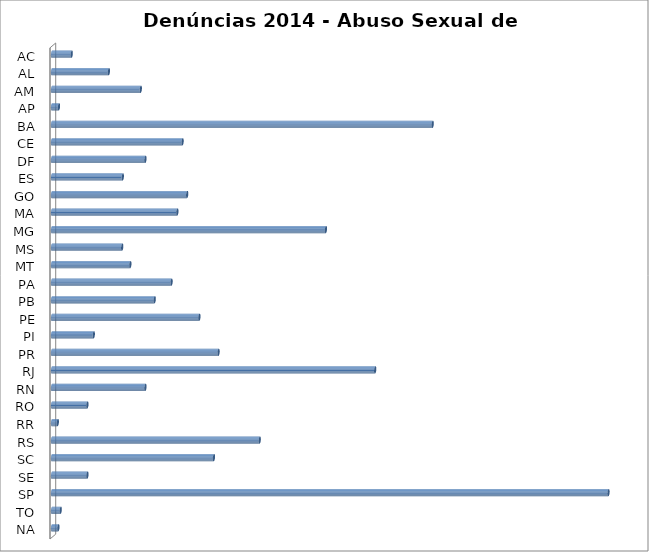
| Category | Series 0 |
|---|---|
| AC | 34 |
| AL | 98 |
| AM | 153 |
| AP | 12 |
| BA | 656 |
| CE | 225 |
| DF | 161 |
| ES | 122 |
| GO | 233 |
| MA | 216 |
| MG | 472 |
| MS | 121 |
| MT | 135 |
| PA | 206 |
| PB | 177 |
| PE | 254 |
| PI | 72 |
| PR | 287 |
| RJ | 557 |
| RN | 161 |
| RO | 61 |
| RR | 10 |
| RS | 358 |
| SC | 279 |
| SE | 61 |
| SP | 959 |
| TO | 15 |
| NA | 11 |